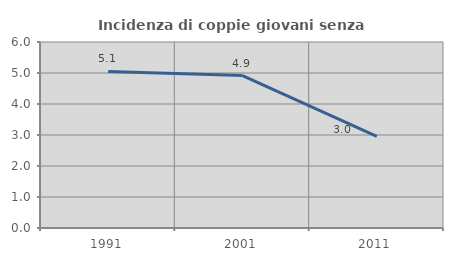
| Category | Incidenza di coppie giovani senza figli |
|---|---|
| 1991.0 | 5.051 |
| 2001.0 | 4.916 |
| 2011.0 | 2.952 |